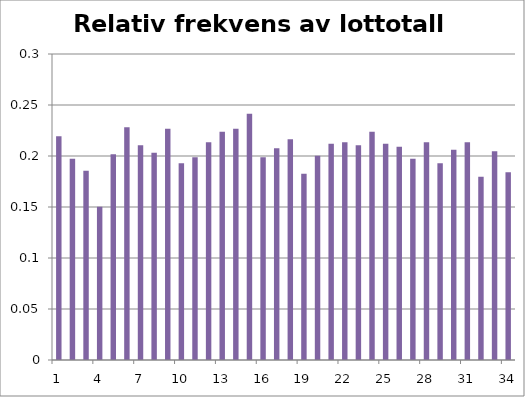
| Category | Relativ frekvens lottotall |
|---|---|
| 1.0 | 0.219 |
| 2.0 | 0.197 |
| 3.0 | 0.186 |
| 4.0 | 0.15 |
| 5.0 | 0.202 |
| 6.0 | 0.228 |
| 7.0 | 0.211 |
| 8.0 | 0.203 |
| 9.0 | 0.227 |
| 10.0 | 0.193 |
| 11.0 | 0.199 |
| 12.0 | 0.214 |
| 13.0 | 0.224 |
| 14.0 | 0.227 |
| 15.0 | 0.242 |
| 16.0 | 0.199 |
| 17.0 | 0.208 |
| 18.0 | 0.216 |
| 19.0 | 0.183 |
| 20.0 | 0.2 |
| 21.0 | 0.212 |
| 22.0 | 0.214 |
| 23.0 | 0.211 |
| 24.0 | 0.224 |
| 25.0 | 0.212 |
| 26.0 | 0.209 |
| 27.0 | 0.197 |
| 28.0 | 0.214 |
| 29.0 | 0.193 |
| 30.0 | 0.206 |
| 31.0 | 0.214 |
| 32.0 | 0.18 |
| 33.0 | 0.205 |
| 34.0 | 0.184 |